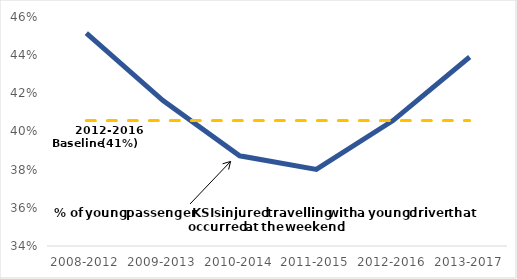
| Category | Series 0 | Series 2 |
|---|---|---|
| 2008-2012 | 0.452 | 0.406 |
| 2009-2013 | 0.416 | 0.406 |
| 2010-2014 | 0.387 | 0.406 |
| 2011-2015 | 0.38 | 0.406 |
| 2012-2016 | 0.406 | 0.406 |
| 2013-2017 | 0.439 | 0.406 |